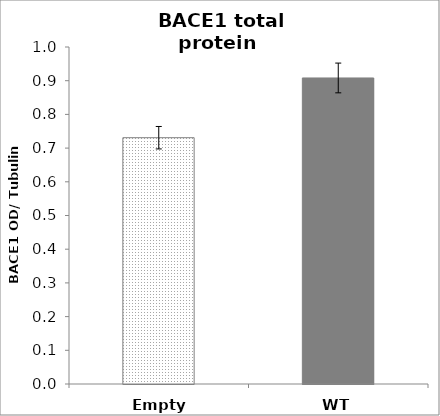
| Category | Series 0 |
|---|---|
| Empty vector | 0.731 |
| WT | 0.908 |